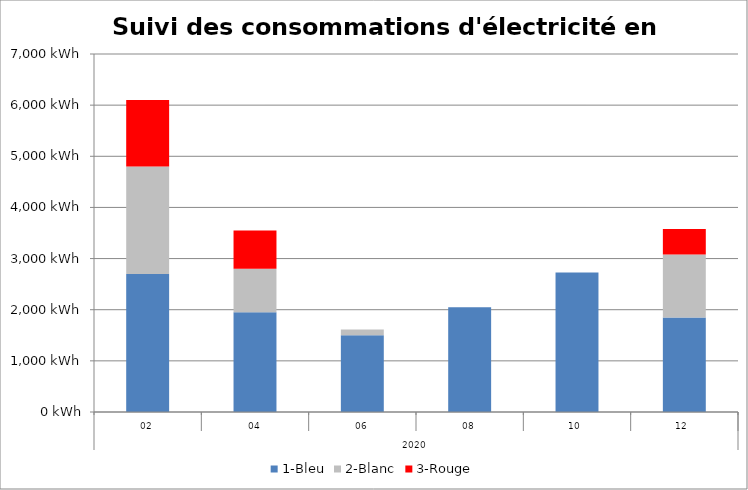
| Category | 1-Bleu | 2-Blanc | 3-Rouge |
|---|---|---|---|
| 0 | 2700 | 2100 | 1300 |
| 1 | 1950 | 850 | 750 |
| 2 | 1500 | 115 | 0 |
| 3 | 2050 | 0 | 0 |
| 4 | 2730 | 0 | 0 |
| 5 | 1850 | 1230 | 500 |